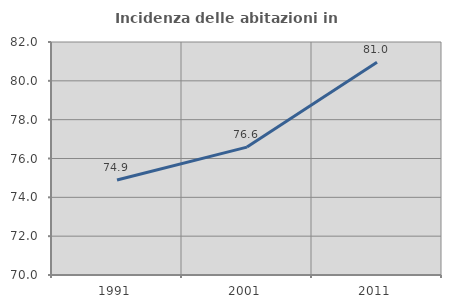
| Category | Incidenza delle abitazioni in proprietà  |
|---|---|
| 1991.0 | 74.891 |
| 2001.0 | 76.586 |
| 2011.0 | 80.952 |